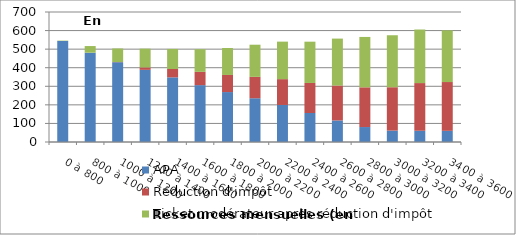
| Category | APA | Réduction d'impôt | Ticket modérateur après réduction d'impôt |
|---|---|---|---|
| 0 à 800 | 543.835 | 0 | 2.075 |
| 800 à 1000 | 480.857 | 0 | 35.782 |
| 1000 à 1200 | 429.576 | 1.035 | 73.022 |
| 1200 à 1400 | 388.455 | 13.118 | 101.023 |
| 1400 à 1600 | 348.045 | 45.062 | 108.036 |
| 1600 à 1800 | 306.166 | 71.444 | 122.177 |
| 1800 à 2000 | 268.873 | 92.111 | 145.062 |
| 2000 à 2200 | 235.579 | 115.135 | 173.133 |
| 2200 à 2400 | 199.406 | 139.084 | 201.971 |
| 2400 à 2600 | 156.04 | 161.838 | 222.304 |
| 2600 à 2800 | 116.045 | 187.989 | 252.788 |
| 2800 à 3000 | 80.569 | 213.895 | 271.23 |
| 3000 à 3200 | 61.43 | 233.46 | 279.943 |
| 3200 à 3400 | 60.568 | 256.725 | 288.382 |
| 3400 à 3600 | 60.121 | 262.764 | 278.326 |